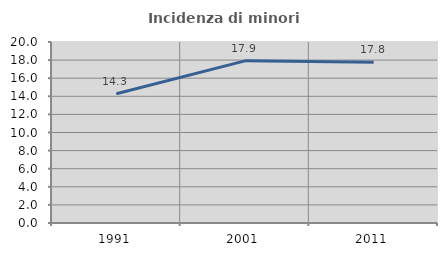
| Category | Incidenza di minori stranieri |
|---|---|
| 1991.0 | 14.286 |
| 2001.0 | 17.917 |
| 2011.0 | 17.77 |